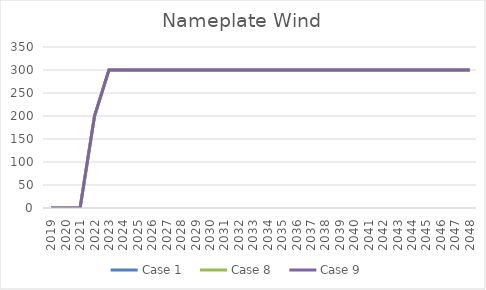
| Category | Case 1 | Case 8 | Case 9 |
|---|---|---|---|
| 2019.0 | 0 | 0 | 0 |
| 2020.0 | 0 | 0 | 0 |
| 2021.0 | 0 | 0 | 0 |
| 2022.0 | 200 | 200 | 200 |
| 2023.0 | 300 | 300 | 300 |
| 2024.0 | 300 | 300 | 300 |
| 2025.0 | 300 | 300 | 300 |
| 2026.0 | 300 | 300 | 300 |
| 2027.0 | 300 | 300 | 300 |
| 2028.0 | 300 | 300 | 300 |
| 2029.0 | 300 | 300 | 300 |
| 2030.0 | 300 | 300 | 300 |
| 2031.0 | 300 | 300 | 300 |
| 2032.0 | 300 | 300 | 300 |
| 2033.0 | 300 | 300 | 300 |
| 2034.0 | 300 | 300 | 300 |
| 2035.0 | 300 | 300 | 300 |
| 2036.0 | 300 | 300 | 300 |
| 2037.0 | 300 | 300 | 300 |
| 2038.0 | 300 | 300 | 300 |
| 2039.0 | 300 | 300 | 300 |
| 2040.0 | 300 | 300 | 300 |
| 2041.0 | 300 | 300 | 300 |
| 2042.0 | 300 | 300 | 300 |
| 2043.0 | 300 | 300 | 300 |
| 2044.0 | 300 | 300 | 300 |
| 2045.0 | 300 | 300 | 300 |
| 2046.0 | 300 | 300 | 300 |
| 2047.0 | 300 | 300 | 300 |
| 2048.0 | 300 | 300 | 300 |